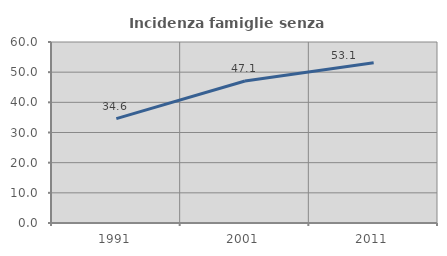
| Category | Incidenza famiglie senza nuclei |
|---|---|
| 1991.0 | 34.584 |
| 2001.0 | 47.087 |
| 2011.0 | 53.141 |